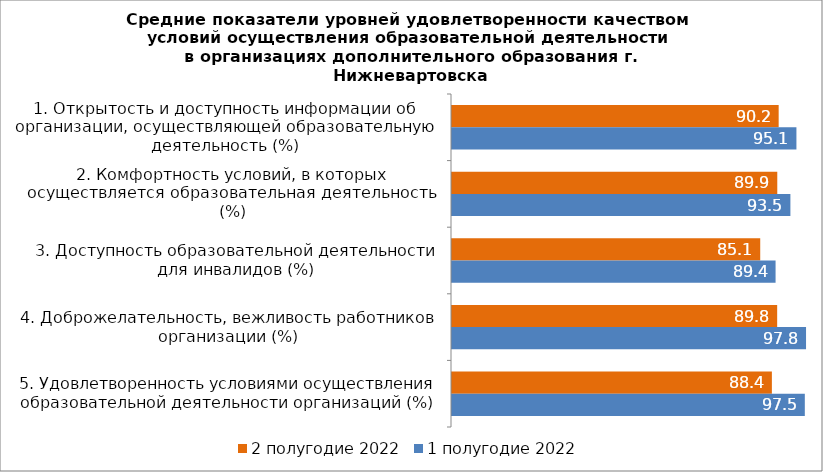
| Category | 2 полугодие 2022 | 1 полугодие 2022 |
|---|---|---|
| 1. Открытость и доступность информации об организации, осуществляющей образовательную деятельность (%) | 90.24 | 95.145 |
| 2. Комфортность условий, в которых осуществляется образовательная деятельность (%) | 89.855 | 93.48 |
| 3. Доступность образовательной деятельности для инвалидов (%) | 85.145 | 89.385 |
| 4. Доброжелательность, вежливость работников организации (%) | 89.825 | 97.8 |
| 5. Удовлетворенность условиями осуществления образовательной деятельности организаций (%) | 88.365 | 97.465 |